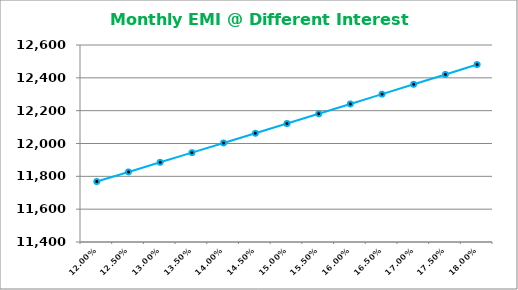
| Category | Interest Rate |
|---|---|
| 0.12 | 11768.368 |
| 0.125 | 11826.827 |
| 0.13 | 11885.456 |
| 0.135 | 11944.254 |
| 0.14 | 12003.221 |
| 0.14500000000000002 | 12062.357 |
| 0.15000000000000002 | 12121.662 |
| 0.15500000000000003 | 12181.136 |
| 0.16000000000000003 | 12240.778 |
| 0.16500000000000004 | 12300.588 |
| 0.17000000000000004 | 12360.566 |
| 0.17500000000000004 | 12420.712 |
| 0.18000000000000005 | 12481.025 |